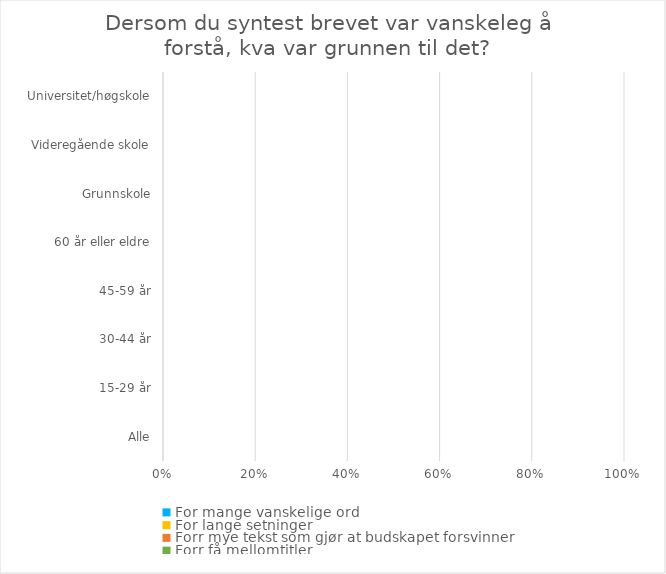
| Category | For mange vanskelige ord | For lange setninger | Forr mye tekst som gjør at budskapet forsvinner | Forr få mellomtitler |
|---|---|---|---|---|
| Alle | 0 | 0 | 0 | 0 |
| 15-29 år | 0 | 0 | 0 | 0 |
| 30-44 år | 0 | 0 | 0 | 0 |
| 45-59 år | 0 | 0 | 0 | 0 |
| 60 år eller eldre | 0 | 0 | 0 | 0 |
| Grunnskole | 0 | 0 | 0 | 0 |
| Videregående skole | 0 | 0 | 0 | 0 |
| Universitet/høgskole | 0 | 0 | 0 | 0 |